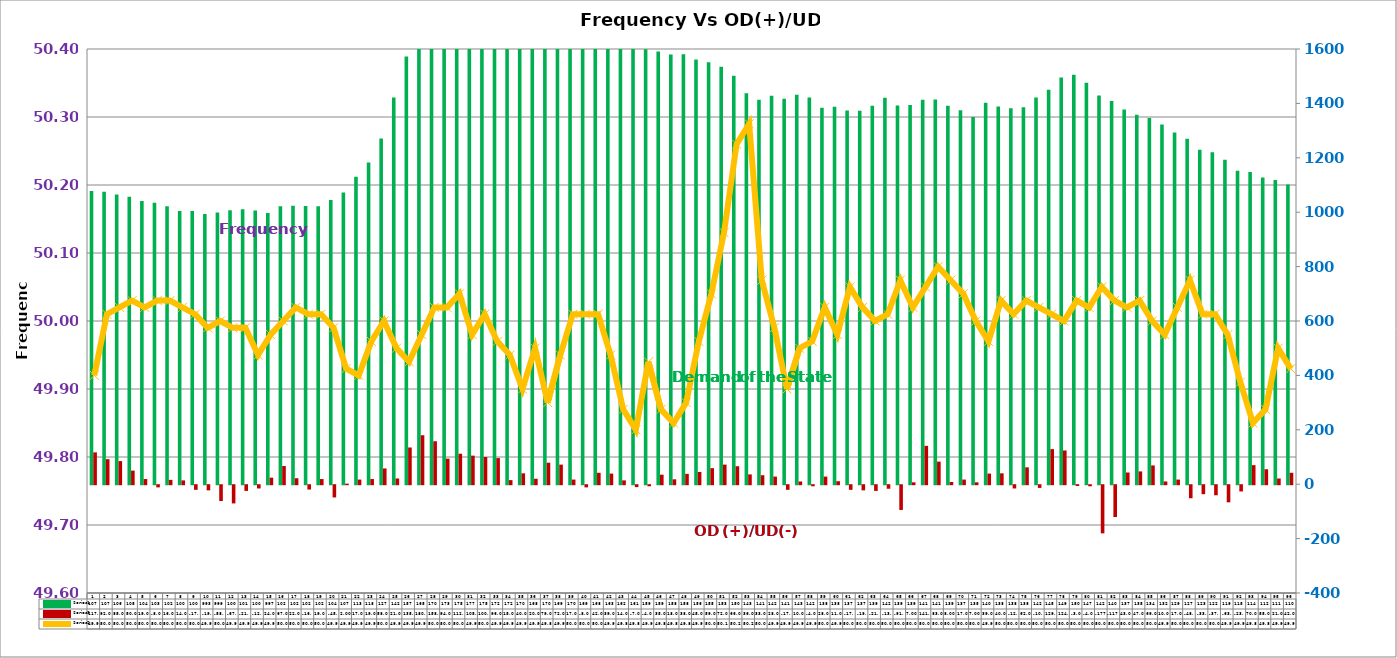
| Category | Series 2 | Series 4 |
|---|---|---|
| 0 | 1078 | 117 |
| 1 | 1075 | 92 |
| 2 | 1065 | 85 |
| 3 | 1057 | 50 |
| 4 | 1041 | 19 |
| 5 | 1035 | -8 |
| 6 | 1022 | 16 |
| 7 | 1004 | 14 |
| 8 | 1004 | -17 |
| 9 | 993 | -19 |
| 10 | 999 | -58 |
| 11 | 1007 | -67 |
| 12 | 1011 | -21 |
| 13 | 1006 | -12 |
| 14 | 997 | 24 |
| 15 | 1022 | 67 |
| 16 | 1024 | 22 |
| 17 | 1023 | -16 |
| 18 | 1022 | 19 |
| 19 | 1045 | -45 |
| 20 | 1072 | 2 |
| 21 | 1130 | 17 |
| 22 | 1183 | 19 |
| 23 | 1271 | 58 |
| 24 | 1422 | 21 |
| 25 | 1572 | 135 |
| 26 | 1652 | 180 |
| 27 | 1705 | 158 |
| 28 | 1732 | 94 |
| 29 | 1750 | 112 |
| 30 | 1770 | 105 |
| 31 | 1756 | 100 |
| 32 | 1726 | 96 |
| 33 | 1722 | 15 |
| 34 | 1702 | 40 |
| 35 | 1689 | 20 |
| 36 | 1707 | 79 |
| 37 | 1698 | 72 |
| 38 | 1705 | 17 |
| 39 | 1693 | -8 |
| 40 | 1680 | 42 |
| 41 | 1638 | 39 |
| 42 | 1624 | 14 |
| 43 | 1611 | -7 |
| 44 | 1599 | -4 |
| 45 | 1591 | 35 |
| 46 | 1580 | 18 |
| 47 | 1581 | 38 |
| 48 | 1561 | 45 |
| 49 | 1551 | 59 |
| 50 | 1535 | 72 |
| 51 | 1502 | 66 |
| 52 | 1437 | 36 |
| 53 | 1413 | 33 |
| 54 | 1428 | 28 |
| 55 | 1417 | -17 |
| 56 | 1432 | 10 |
| 57 | 1422 | -4 |
| 58 | 1384 | 28 |
| 59 | 1388 | 11 |
| 60 | 1374 | -17 |
| 61 | 1373 | -19 |
| 62 | 1391 | -21 |
| 63 | 1421 | -13 |
| 64 | 1392 | -91 |
| 65 | 1394 | 7 |
| 66 | 1413 | 141 |
| 67 | 1414 | 83 |
| 68 | 1391 | 8 |
| 69 | 1375 | 17 |
| 70 | 1350 | 7 |
| 71 | 1402 | 39 |
| 72 | 1389 | 40 |
| 73 | 1382 | -12 |
| 74 | 1386 | 62 |
| 75 | 1422 | -10 |
| 76 | 1450 | 129 |
| 77 | 1495 | 124 |
| 78 | 1505 | -3 |
| 79 | 1476 | -4 |
| 80 | 1429 | -177 |
| 81 | 1409 | -117 |
| 82 | 1378 | 43 |
| 83 | 1358 | 47 |
| 84 | 1346 | 69 |
| 85 | 1322 | 10 |
| 86 | 1293 | 17 |
| 87 | 1270 | -48 |
| 88 | 1230 | -33 |
| 89 | 1220 | -37 |
| 90 | 1193 | -63 |
| 91 | 1152 | -23 |
| 92 | 1148 | 70 |
| 93 | 1128 | 55 |
| 94 | 1118 | 21 |
| 95 | 1102 | 42 |